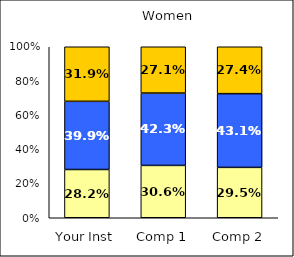
| Category | Low Leadership | Average Leadership | High Leadership |
|---|---|---|---|
| Your Inst | 0.282 | 0.399 | 0.319 |
| Comp 1 | 0.306 | 0.423 | 0.271 |
| Comp 2 | 0.295 | 0.431 | 0.274 |